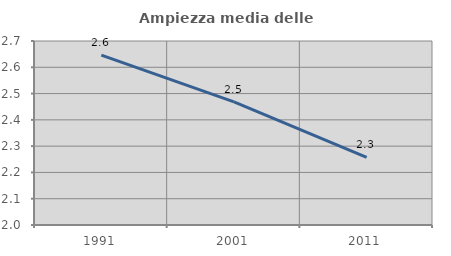
| Category | Ampiezza media delle famiglie |
|---|---|
| 1991.0 | 2.646 |
| 2001.0 | 2.469 |
| 2011.0 | 2.257 |